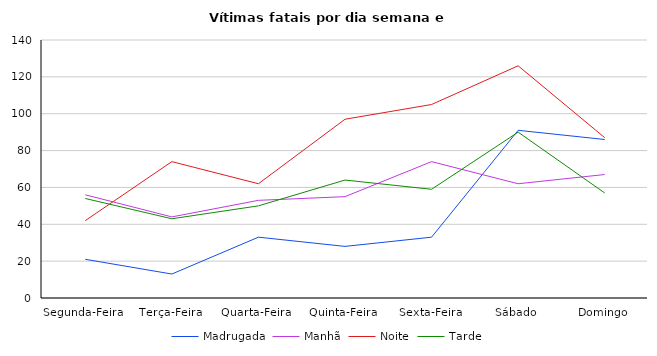
| Category | Madrugada | Manhã | Noite | Tarde |
|---|---|---|---|---|
| Segunda-Feira | 21 | 56 | 42 | 54 |
| Terça-Feira | 13 | 44 | 74 | 43 |
| Quarta-Feira | 33 | 53 | 62 | 50 |
| Quinta-Feira | 28 | 55 | 97 | 64 |
| Sexta-Feira | 33 | 74 | 105 | 59 |
| Sábado | 91 | 62 | 126 | 90 |
| Domingo | 86 | 67 | 87 | 57 |